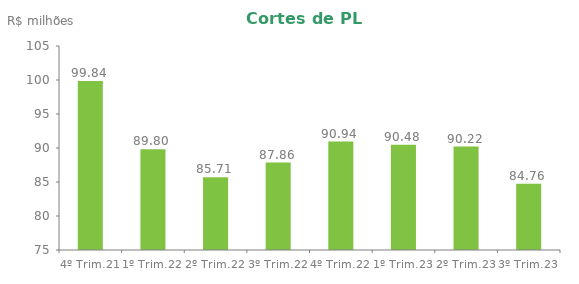
| Category | Series 0 |
|---|---|
| 4º Trim.21 | 99.84 |
| 1º Trim.22 | 89.798 |
| 2º Trim.22 | 85.707 |
| 3º Trim.22 | 87.86 |
| 4º Trim.22 | 90.94 |
| 1º Trim.23 | 90.48 |
| 2º Trim.23 | 90.22 |
| 3º Trim.23 | 84.76 |